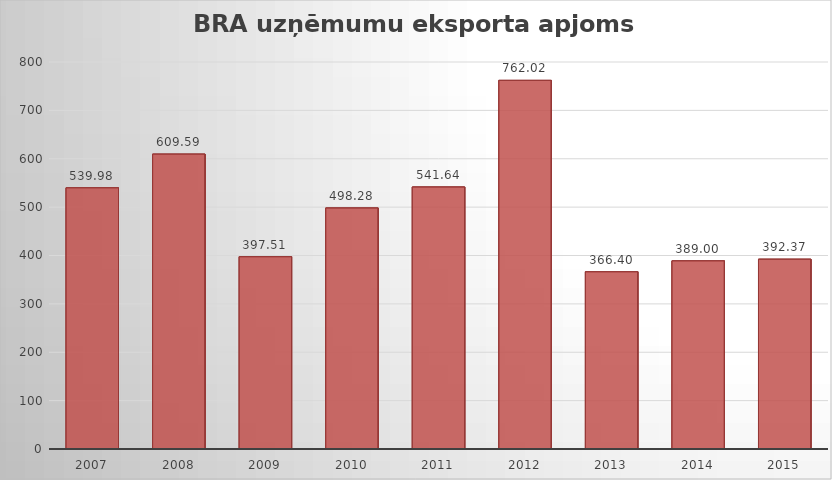
| Category | Series 0 |
|---|---|
| 2007.0 | 539.98 |
| 2008.0 | 609.59 |
| 2009.0 | 397.51 |
| 2010.0 | 498.28 |
| 2011.0 | 541.64 |
| 2012.0 | 762.02 |
| 2013.0 | 366.4 |
| 2014.0 | 389 |
| 2015.0 | 392.37 |